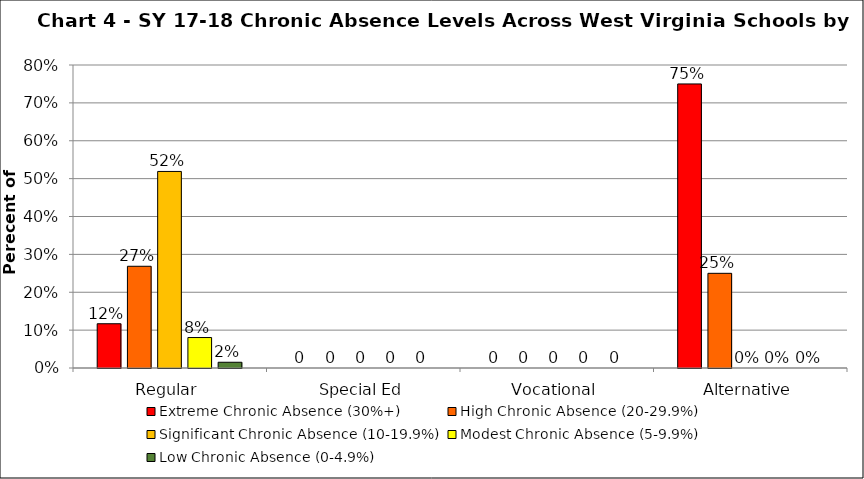
| Category | Extreme Chronic Absence (30%+) | High Chronic Absence (20-29.9%) | Significant Chronic Absence (10-19.9%) | Modest Chronic Absence (5-9.9%) | Low Chronic Absence (0-4.9%) |
|---|---|---|---|---|---|
| 0 | 0.117 | 0.269 | 0.519 | 0.08 | 0.015 |
| 1 | 0 | 0 | 0 | 0 | 0 |
| 2 | 0 | 0 | 0 | 0 | 0 |
| 3 | 0.75 | 0.25 | 0 | 0 | 0 |